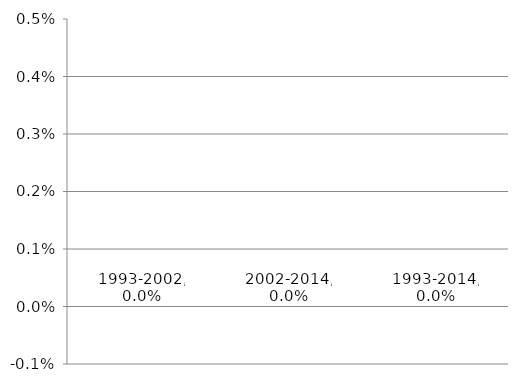
| Category | Series 0 |
|---|---|
| 1993-2002 | 0 |
| 2002-2014 | 0 |
| 1993-2014 | 0 |